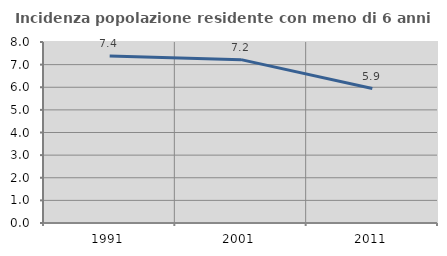
| Category | Incidenza popolazione residente con meno di 6 anni |
|---|---|
| 1991.0 | 7.382 |
| 2001.0 | 7.221 |
| 2011.0 | 5.944 |